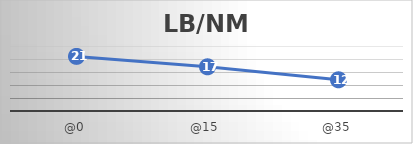
| Category | LB/NM |
|---|---|
| @0 | 21 |
| @15 | 17 |
| @35 | 12 |